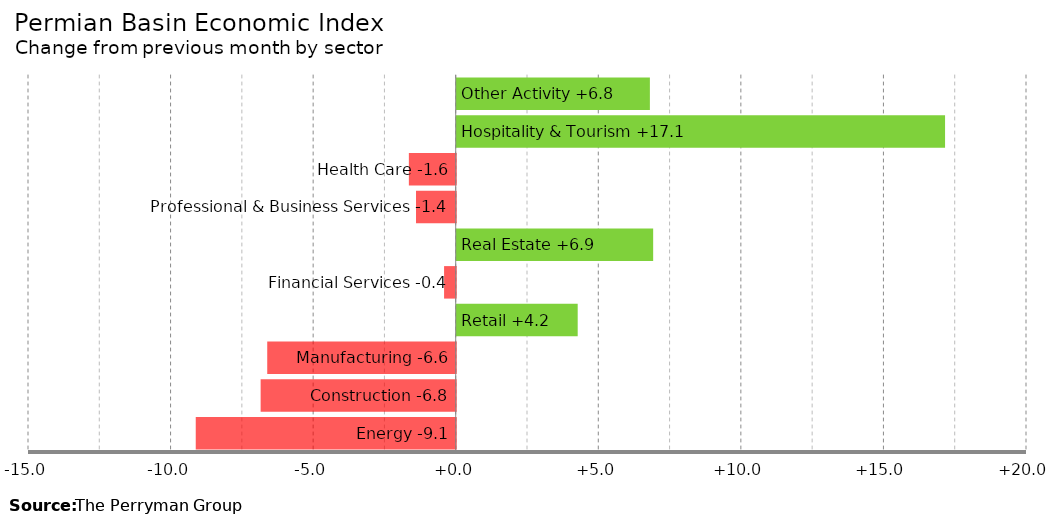
| Category | Change |
|---|---|
| Energy | -9.117 |
| Construction | -6.841 |
| Manufacturing | -6.61 |
| Retail | 4.243 |
| Financial Services | -0.408 |
| Real Estate | 6.89 |
| Professional & Business Services | -1.392 |
| Health Care | -1.643 |
| Hospitality & Tourism | 17.126 |
| Other Activity | 6.775 |